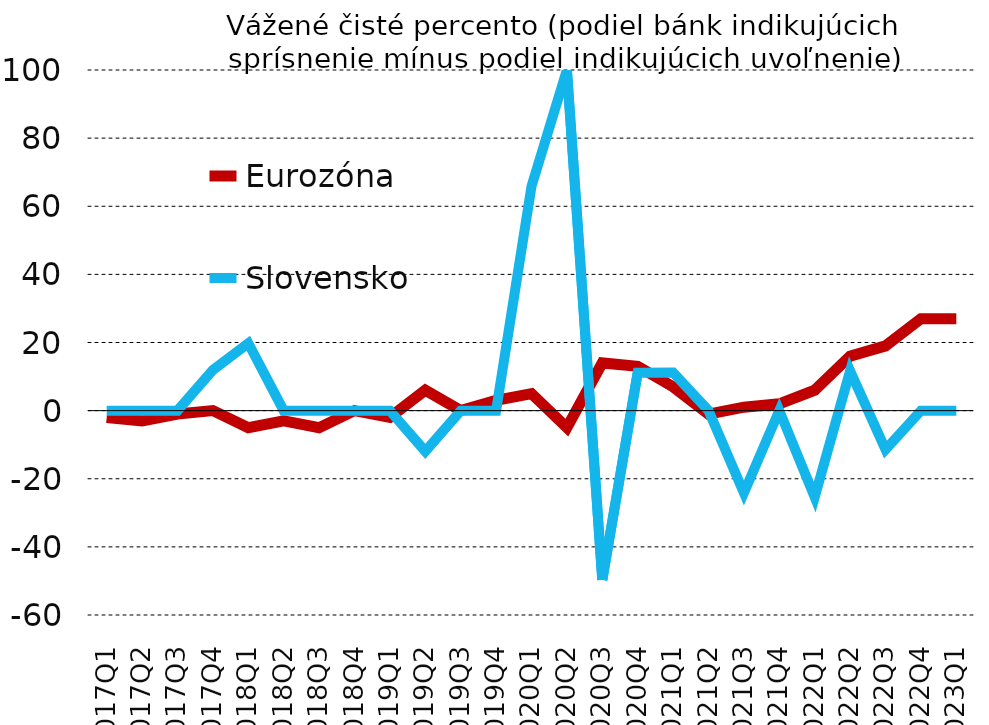
| Category | Eurozóna | Slovensko |
|---|---|---|
| 2017Q1 | -2 | 0 |
| 2017Q2 | -3 | 0 |
| 2017Q3 | -1 | 0 |
| 2017Q4 | 0 | 11.92 |
| 2018Q1 | -5 | 19.8 |
| 2018Q2 | -3 | 0 |
| 2018Q3 | -5 | 0 |
| 2018Q4 | 0 | 0 |
| 2019Q1 | -2 | 0 |
| 2019Q2 | 6 | -11.97 |
| 2019Q3 | 0 | 0 |
| 2019Q4 | 3 | 0 |
| 2020Q1 | 5 | 65.87 |
| 2020Q2 | -5 | 100 |
| 2020Q3 | 14 | -49.68 |
| 2020Q4 | 13 | 11.14 |
| 2021Q1 | 7 | 11.19 |
| 2021Q2 | -1 | 0 |
| 2021Q3 | 1 | -24.15 |
| 2021Q4 | 2 | 0 |
| 2022Q1 | 6 | -25.4 |
| 2022Q2 | 16 | 11.64 |
| 2022Q3 | 19 | -11.44 |
| 2022Q4 | 27 | 0 |
| 2023Q1 | 27 | 0 |